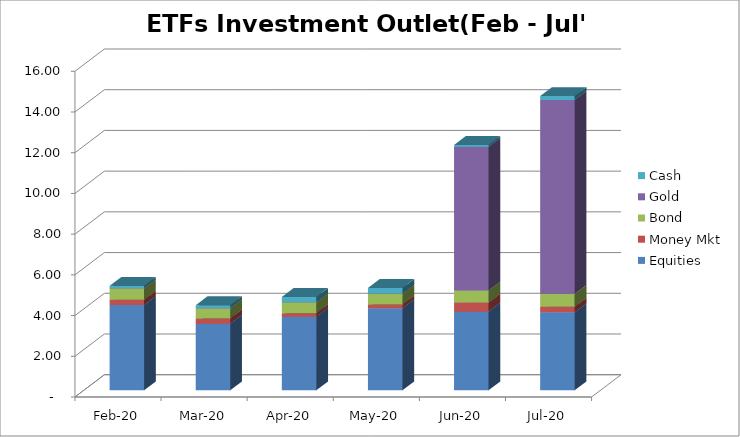
| Category | Equities | Money Mkt | Bond | Gold | Cash |
|---|---|---|---|---|---|
| 2020-02-01 | 4193271504.52 | 252081379.79 | 568973079.15 | 0 | 116675921.8 |
| 2020-03-01 | 3274342665.32 | 259460908.27 | 495910824.65 | 0 | 150095912.89 |
| 2020-04-01 | 3614392230.14 | 175752553.41 | 535087967.52 | 0 | 260113227.03 |
| 2020-05-01 | 4032265012.12 | 177070409.49 | 538903891.86 | 0 | 278503239.37 |
| 2020-06-01 | 3864587279.22 | 452492408.13 | 591048061.03 | 7051738147.24 | 93622092.4 |
| 2020-07-01 | 3831828644.68 | 272103487.34 | 625862830.11 | 9533055643.75 | 191169576.23 |